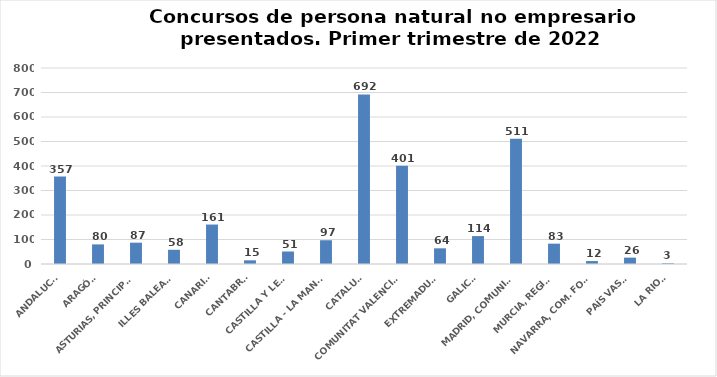
| Category | Series 0 |
|---|---|
| ANDALUCÍA | 357 |
| ARAGÓN | 80 |
| ASTURIAS, PRINCIPADO | 87 |
| ILLES BALEARS | 58 |
| CANARIAS | 161 |
| CANTABRIA | 15 |
| CASTILLA Y LEÓN | 51 |
| CASTILLA - LA MANCHA | 97 |
| CATALUÑA | 692 |
| COMUNITAT VALENCIANA | 401 |
| EXTREMADURA | 64 |
| GALICIA | 114 |
| MADRID, COMUNIDAD | 511 |
| MURCIA, REGIÓN | 83 |
| NAVARRA, COM. FORAL | 12 |
| PAÍS VASCO | 26 |
| LA RIOJA | 3 |